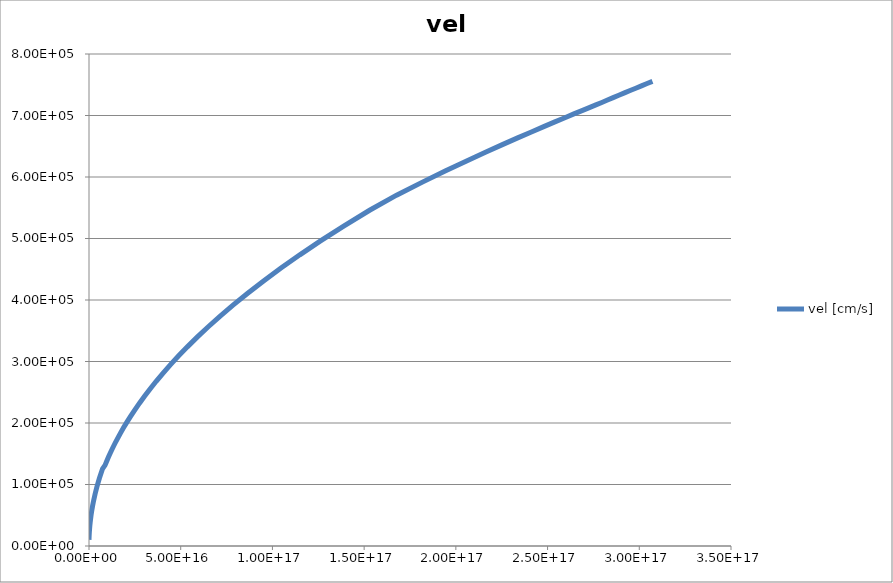
| Category | vel [cm/s] |
|---|---|
| 1092500000000.0 | 10000 |
| 6555010000000.0 | 10789 |
| 22953200000000.0 | 12711 |
| 49567400000000.0 | 14707 |
| 83115300000000.0 | 16955 |
| 126728000000000.0 | 19492 |
| 183424000000000.0 | 22365 |
| 257128000000000.0 | 25621 |
| 352944000000000.0 | 29318 |
| 477505000000000.0 | 33520 |
| 639435000000000.0 | 38299 |
| 849943000000000.0 | 43737 |
| 1123600000000000.0 | 49928 |
| 1479360000000000.0 | 56979 |
| 1941850000000000.0 | 65011 |
| 2543080000000000.0 | 74163 |
| 3324680000000000.0 | 84592 |
| 4340760000000000.0 | 96478 |
| 5661670000000000.0 | 110030 |
| 7378850000000000.0 | 125470 |
| 8766900000000000.0 | 131550 |
| 9643590000000000.0 | 137920 |
| 1.0608e+16 | 144600 |
| 1.16687e+16 | 151600 |
| 1.28356e+16 | 158950 |
| 1.41192e+16 | 166650 |
| 1.55311e+16 | 174730 |
| 1.70842e+16 | 183210 |
| 1.87926e+16 | 192100 |
| 2.06719e+16 | 201430 |
| 2.27391e+16 | 211210 |
| 2.5013e+16 | 221470 |
| 2.75143e+16 | 232240 |
| 3.02657e+16 | 243530 |
| 3.32923e+16 | 255370 |
| 3.66215e+16 | 267790 |
| 4.02837e+16 | 280810 |
| 4.4312e+16 | 294470 |
| 4.87433e+16 | 308800 |
| 5.36176e+16 | 323820 |
| 5.89793e+16 | 339580 |
| 6.48773e+16 | 356100 |
| 7.1365e+16 | 373420 |
| 7.85015e+16 | 391590 |
| 8.63516e+16 | 410630 |
| 9.49868e+16 | 430600 |
| 1.04485e+17 | 451540 |
| 1.14934e+17 | 473490 |
| 1.26427e+17 | 496500 |
| 1.3907e+17 | 520630 |
| 1.52977e+17 | 545920 |
| 1.67677e+17 | 570490 |
| 1.81766e+17 | 591670 |
| 1.94446e+17 | 610010 |
| 2.05858e+17 | 626080 |
| 2.16129e+17 | 640210 |
| 2.25373e+17 | 652620 |
| 2.33693e+17 | 663580 |
| 2.4118e+17 | 673290 |
| 2.47919e+17 | 681920 |
| 2.53984e+17 | 689600 |
| 2.59442e+17 | 696440 |
| 2.64355e+17 | 702550 |
| 2.68776e+17 | 708010 |
| 2.72755e+17 | 712890 |
| 2.76337e+17 | 717250 |
| 2.79576e+17 | 721190 |
| 2.82661e+17 | 725110 |
| 2.85747e+17 | 729010 |
| 2.88833e+17 | 732890 |
| 2.91918e+17 | 736750 |
| 2.95004e+17 | 740590 |
| 2.9809e+17 | 744410 |
| 3.01175e+17 | 748210 |
| 3.04261e+17 | 751990 |
| 3.07186e+17 | 755360 |